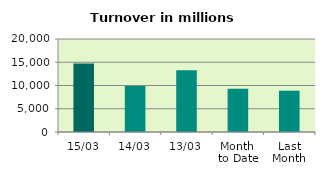
| Category | Series 0 |
|---|---|
| 15/03 | 14742.906 |
| 14/03 | 9873.415 |
| 13/03 | 13273.481 |
| Month 
to Date | 9295.056 |
| Last
Month | 8884.685 |